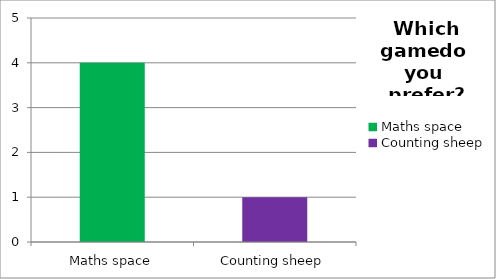
| Category | Series 0 |
|---|---|
| Maths space | 4 |
| Counting sheep | 1 |